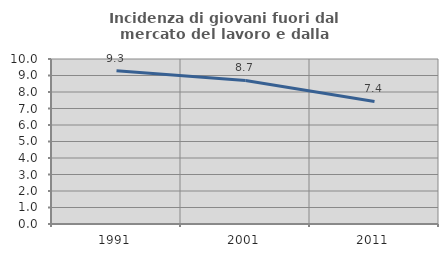
| Category | Incidenza di giovani fuori dal mercato del lavoro e dalla formazione  |
|---|---|
| 1991.0 | 9.286 |
| 2001.0 | 8.701 |
| 2011.0 | 7.426 |